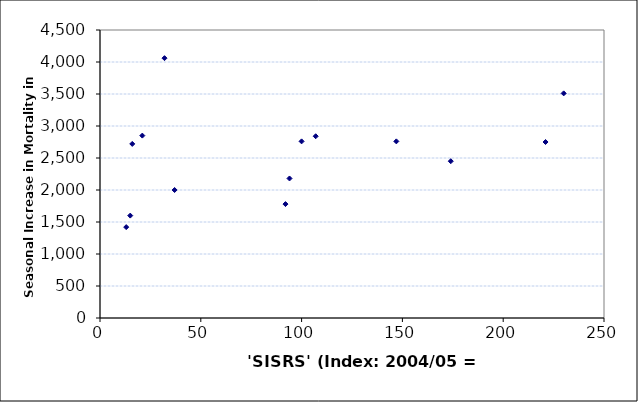
| Category | Seas. Incr. Mort |
|---|---|
| 107.0 | 2840 |
| 100.0 | 2760 |
| 92.0 | 1780 |
| 221.0 | 2750 |
| 94.0 | 2180 |
| 230.0 | 3510 |
| 147.0 | 2760 |
| 174.0 | 2450 |
| 13.0 | 1420 |
| 37.0 | 2000 |
| 15.0 | 1600 |
| 32.0 | 4060 |
| 21.0 | 2850 |
| 16.0 | 2720 |